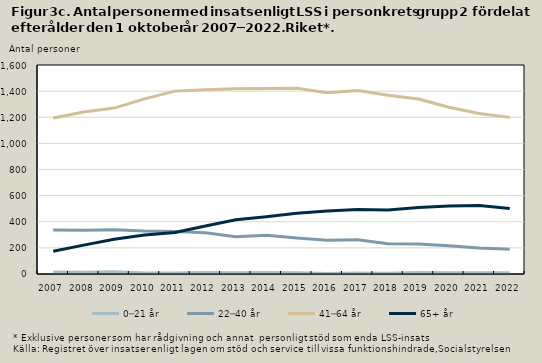
| Category | 0─21 år | 22─40 år | 41─64 år | 65+ år |
|---|---|---|---|---|
| 2007.0 | 15 | 337 | 1195 | 174 |
| 2008.0 | 13 | 335 | 1240 | 221 |
| 2009.0 | 17 | 339 | 1270 | 266 |
| 2010.0 | 7 | 329 | 1341 | 298 |
| 2011.0 | 8 | 326 | 1400 | 318 |
| 2012.0 | 11 | 315 | 1411 | 367 |
| 2013.0 | 9 | 286 | 1419 | 415 |
| 2014.0 | 12 | 297 | 1420 | 439 |
| 2015.0 | 9 | 275 | 1422 | 465 |
| 2016.0 | 3 | 259 | 1388 | 483 |
| 2017.0 | 7 | 263 | 1404 | 494 |
| 2018.0 | 5 | 232 | 1368 | 490 |
| 2019.0 | 11 | 229 | 1340 | 509 |
| 2020.0 | 9 | 217 | 1277 | 521 |
| 2021.0 | 9 | 199 | 1228 | 525 |
| 2022.0 | 9 | 189 | 1199 | 502 |